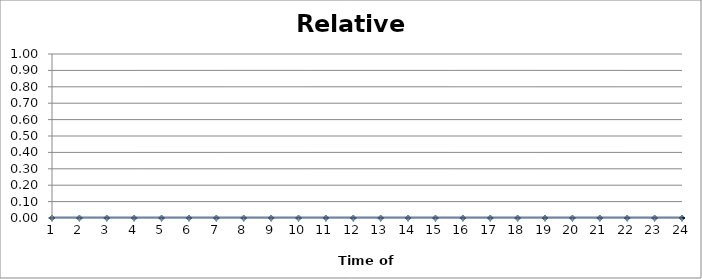
| Category | Relative Risk |
|---|---|
| 1.0 | 0 |
| 2.0 | 0 |
| 3.0 | 0 |
| 4.0 | 0 |
| 5.0 | 0 |
| 6.0 | 0 |
| 7.0 | 0 |
| 8.0 | 0 |
| 9.0 | 0 |
| 10.0 | 0 |
| 11.0 | 0 |
| 12.0 | 0 |
| 13.0 | 0 |
| 14.0 | 0 |
| 15.0 | 0 |
| 16.0 | 0 |
| 17.0 | 0 |
| 18.0 | 0 |
| 19.0 | 0 |
| 20.0 | 0 |
| 21.0 | 0 |
| 22.0 | 0 |
| 23.0 | 0 |
| 24.0 | 0 |